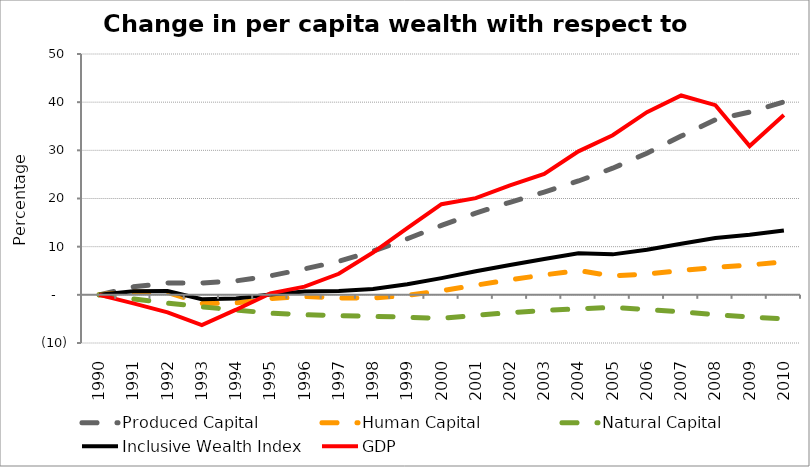
| Category | Produced Capital  | Human Capital | Natural Capital | Inclusive Wealth Index | GDP |
|---|---|---|---|---|---|
| 1990.0 | 0 | 0 | 0 | 0 | 0 |
| 1991.0 | 1.66 | 0.602 | -0.865 | 0.745 | -1.765 |
| 1992.0 | 2.447 | 0.506 | -1.706 | 0.796 | -3.636 |
| 1993.0 | 2.464 | -1.788 | -2.481 | -0.903 | -6.279 |
| 1994.0 | 2.888 | -1.688 | -3.162 | -0.779 | -3.085 |
| 1995.0 | 3.94 | -0.772 | -3.806 | 0.073 | 0.31 |
| 1996.0 | 5.384 | -0.347 | -4.102 | 0.677 | 1.692 |
| 1997.0 | 6.954 | -0.653 | -4.341 | 0.783 | 4.369 |
| 1998.0 | 9.067 | -0.688 | -4.48 | 1.21 | 8.774 |
| 1999.0 | 11.641 | -0.105 | -4.641 | 2.182 | 13.844 |
| 2000.0 | 14.412 | 0.857 | -4.894 | 3.465 | 18.81 |
| 2001.0 | 16.973 | 1.997 | -4.262 | 4.885 | 20.081 |
| 2002.0 | 19.212 | 3.108 | -3.698 | 6.208 | 22.72 |
| 2003.0 | 21.336 | 4.148 | -3.264 | 7.448 | 25.115 |
| 2004.0 | 23.633 | 5.034 | -2.895 | 8.61 | 29.795 |
| 2005.0 | 26.288 | 3.922 | -2.611 | 8.402 | 33.136 |
| 2006.0 | 29.393 | 4.342 | -3.049 | 9.356 | 37.919 |
| 2007.0 | 32.954 | 5.028 | -3.545 | 10.597 | 41.391 |
| 2008.0 | 36.346 | 5.702 | -4.107 | 11.789 | 39.375 |
| 2009.0 | 37.944 | 6.2 | -4.601 | 12.467 | 30.89 |
| 2010.0 | 40.066 | 6.832 | -5.012 | 13.361 | 37.328 |